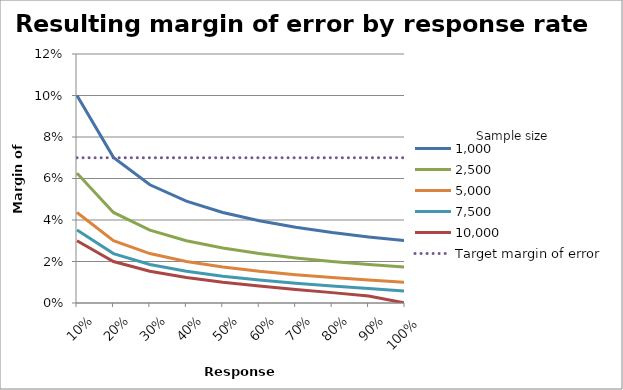
| Category |  1,000  |  2,500  |  5,000  |  7,500  |  10,000  | Target margin of error |
|---|---|---|---|---|---|---|
| 0.1 | 0.1 | 0.063 | 0.044 | 0.035 | 0.03 | 0.07 |
| 0.2 | 0.07 | 0.044 | 0.03 | 0.024 | 0.02 | 0.07 |
| 0.3 | 0.057 | 0.035 | 0.024 | 0.019 | 0.015 | 0.07 |
| 0.4 | 0.049 | 0.03 | 0.02 | 0.015 | 0.012 | 0.07 |
| 0.5 | 0.044 | 0.026 | 0.017 | 0.013 | 0.01 | 0.07 |
| 0.6 | 0.04 | 0.024 | 0.015 | 0.011 | 0.008 | 0.07 |
| 0.7 | 0.036 | 0.022 | 0.014 | 0.01 | 0.007 | 0.07 |
| 0.8 | 0.034 | 0.02 | 0.012 | 0.008 | 0.005 | 0.07 |
| 0.9 | 0.032 | 0.019 | 0.011 | 0.007 | 0.003 | 0.07 |
| 1.0 | 0.03 | 0.017 | 0.01 | 0.006 | 0 | 0.07 |